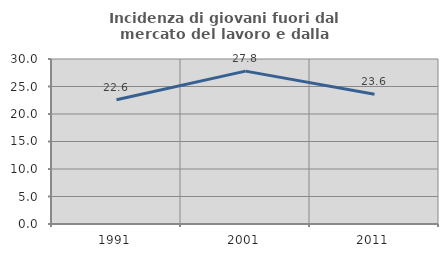
| Category | Incidenza di giovani fuori dal mercato del lavoro e dalla formazione  |
|---|---|
| 1991.0 | 22.592 |
| 2001.0 | 27.795 |
| 2011.0 | 23.607 |